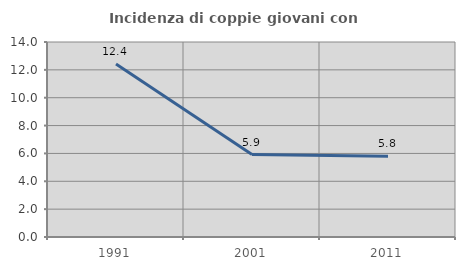
| Category | Incidenza di coppie giovani con figli |
|---|---|
| 1991.0 | 12.422 |
| 2001.0 | 5.915 |
| 2011.0 | 5.789 |